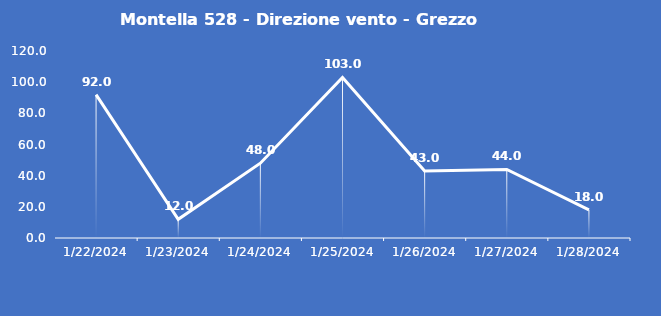
| Category | Montella 528 - Direzione vento - Grezzo (°N) |
|---|---|
| 1/22/24 | 92 |
| 1/23/24 | 12 |
| 1/24/24 | 48 |
| 1/25/24 | 103 |
| 1/26/24 | 43 |
| 1/27/24 | 44 |
| 1/28/24 | 18 |